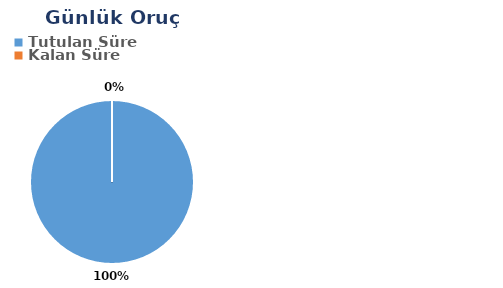
| Category | Günlük |
|---|---|
| Tutulan Süre | 0.582 |
| Kalan Süre | 0 |